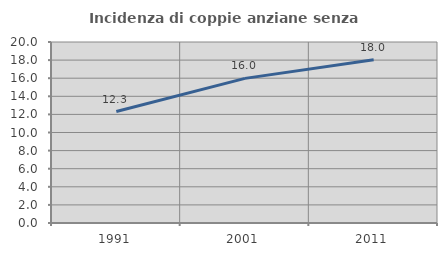
| Category | Incidenza di coppie anziane senza figli  |
|---|---|
| 1991.0 | 12.315 |
| 2001.0 | 15.982 |
| 2011.0 | 18.049 |